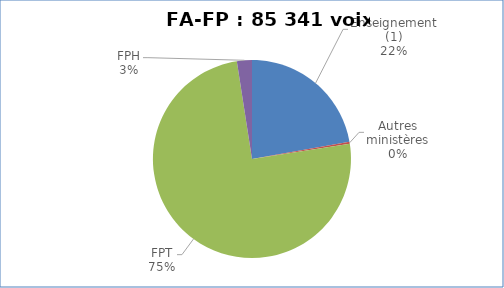
| Category | Nombre de voix |
|---|---|
| Enseignement (1) | 18949 |
| Autres ministères | 293 |
| FPT | 64008 |
| FPH | 2091 |